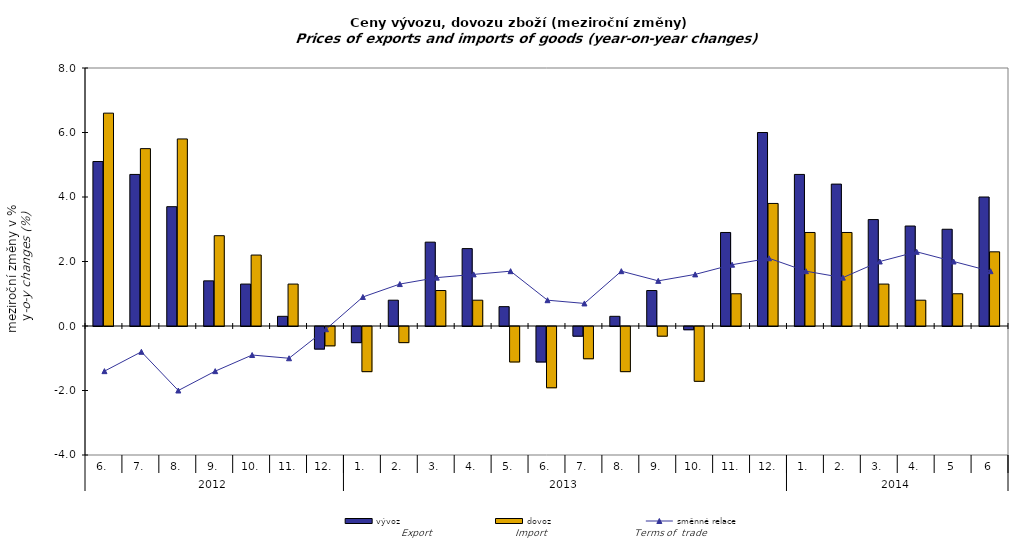
| Category | vývoz | dovoz |
|---|---|---|
| 0 | 5.1 | 6.6 |
| 1 | 4.7 | 5.5 |
| 2 | 3.7 | 5.8 |
| 3 | 1.4 | 2.8 |
| 4 | 1.3 | 2.2 |
| 5 | 0.3 | 1.3 |
| 6 | -0.7 | -0.6 |
| 7 | -0.5 | -1.4 |
| 8 | 0.8 | -0.5 |
| 9 | 2.6 | 1.1 |
| 10 | 2.4 | 0.8 |
| 11 | 0.6 | -1.1 |
| 12 | -1.1 | -1.9 |
| 13 | -0.3 | -1 |
| 14 | 0.3 | -1.4 |
| 15 | 1.1 | -0.3 |
| 16 | -0.1 | -1.7 |
| 17 | 2.9 | 1 |
| 18 | 6 | 3.8 |
| 19 | 4.7 | 2.9 |
| 20 | 4.4 | 2.9 |
| 21 | 3.3 | 1.3 |
| 22 | 3.1 | 0.8 |
| 23 | 3 | 1 |
| 24 | 4 | 2.3 |